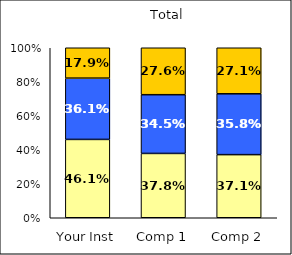
| Category | Low UG Ed Goal: Personal Development | Average UG Ed Goal: Personal Development | High UG Ed Goal: Personal Development |
|---|---|---|---|
| Your Inst | 0.461 | 0.361 | 0.179 |
| Comp 1 | 0.378 | 0.345 | 0.276 |
| Comp 2 | 0.371 | 0.358 | 0.271 |